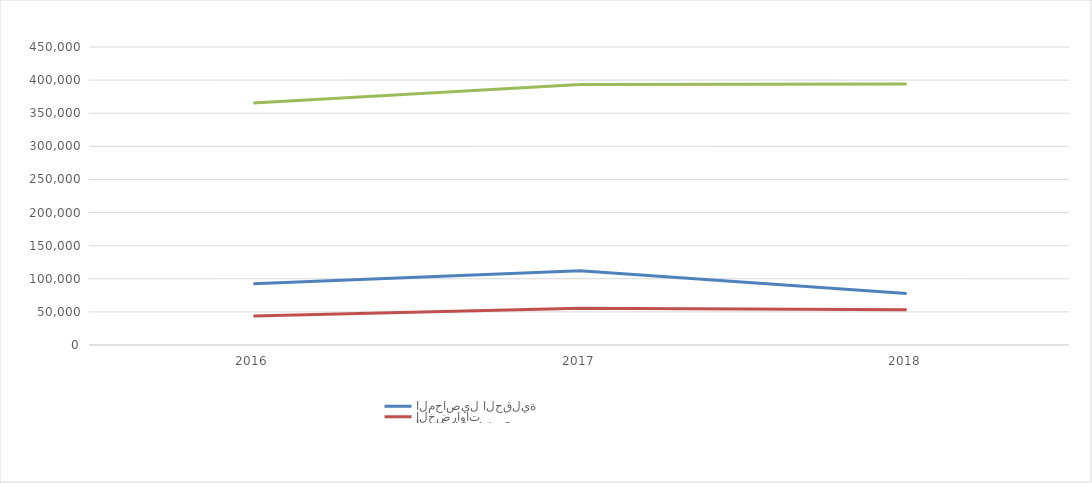
| Category | المحاصيل الحقلية  | الخضراوات | أشجار الفاكهة2 |
|---|---|---|---|
| 2016.0 | 92439.245 | 43974.127 | 365595.626 |
| 2017.0 | 111955.286 | 55480.595 | 393227.94 |
| 2018.0 | 77590.939 | 53203.531 | 393940.424 |